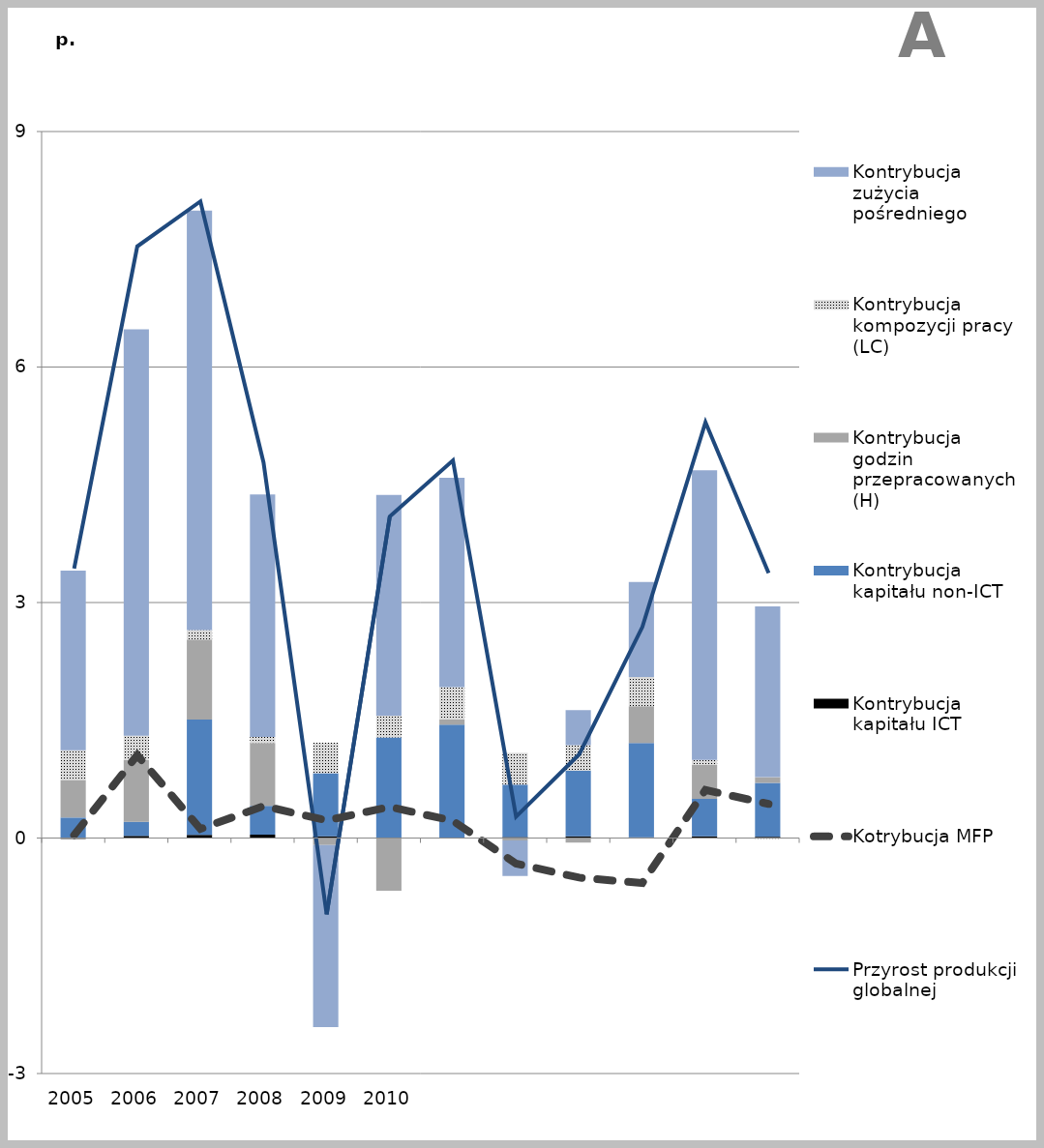
| Category | Kontrybucja kapitału ICT | Kontrybucja kapitału non-ICT | Kontrybucja godzin przepracowanych (H) | Kontrybucja kompozycji pracy (LC) | Kontrybucja zużycia pośredniego |
|---|---|---|---|---|---|
| 2005.0 | -0.011 | 0.261 | 0.479 | 0.379 | 2.289 |
| 2006.0 | 0.027 | 0.18 | 0.788 | 0.307 | 5.178 |
| 2007.0 | 0.04 | 1.469 | 1.019 | 0.12 | 5.346 |
| 2008.0 | 0.043 | 0.367 | 0.802 | 0.076 | 3.089 |
| 2009.0 | 0.022 | 0.804 | -0.089 | 0.389 | -2.321 |
| 2010.0 | -0.004 | 1.282 | -0.667 | 0.278 | 2.811 |